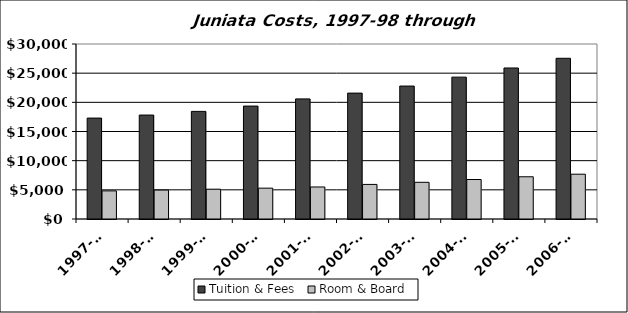
| Category | Tuition & Fees | Room & Board |
|---|---|---|
| 1997-98 | 17300 | 4820 |
| 1998-99 | 17820 | 4960 |
| 1999-00 | 18450 | 5110 |
| 2000-01 | 19360 | 5290 |
| 2001-02 | 20590 | 5490 |
| 2002-03 | 21580 | 5930 |
| 2003-04 | 22790 | 6290 |
| 2004-05 | 24320 | 6770 |
| 2005-06 | 25890 | 7240 |
| 2006-07 | 27550 | 7680 |